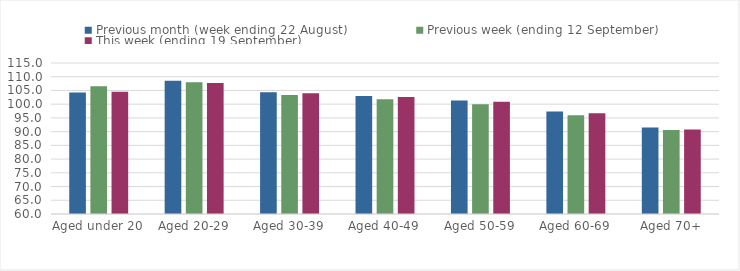
| Category | Previous month (week ending 22 August) | Previous week (ending 12 September) | This week (ending 19 September) |
|---|---|---|---|
| Aged under 20 | 104.24 | 106.54 | 104.52 |
| Aged 20-29 | 108.56 | 107.99 | 107.7 |
| Aged 30-39 | 104.35 | 103.32 | 103.97 |
| Aged 40-49 | 102.98 | 101.77 | 102.66 |
| Aged 50-59 | 101.38 | 99.97 | 100.85 |
| Aged 60-69 | 97.29 | 95.98 | 96.69 |
| Aged 70+ | 91.54 | 90.64 | 90.81 |